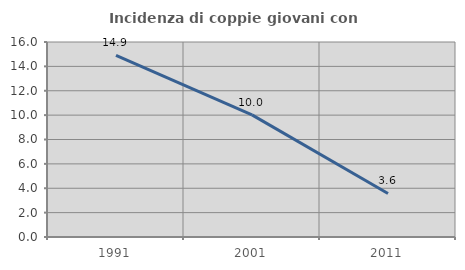
| Category | Incidenza di coppie giovani con figli |
|---|---|
| 1991.0 | 14.912 |
| 2001.0 | 10.023 |
| 2011.0 | 3.571 |